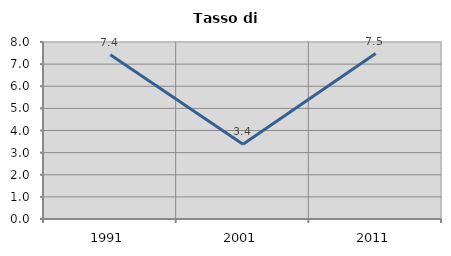
| Category | Tasso di disoccupazione   |
|---|---|
| 1991.0 | 7.42 |
| 2001.0 | 3.383 |
| 2011.0 | 7.477 |